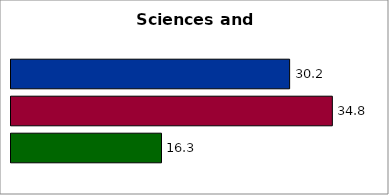
| Category | 50 states and D.C. | SREB states | State |
|---|---|---|---|
| 0 | 30.205 | 34.834 | 16.313 |